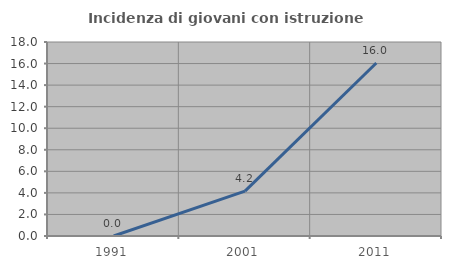
| Category | Incidenza di giovani con istruzione universitaria |
|---|---|
| 1991.0 | 0 |
| 2001.0 | 4.167 |
| 2011.0 | 16.049 |